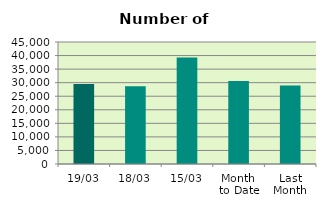
| Category | Series 0 |
|---|---|
| 19/03 | 29480 |
| 18/03 | 28680 |
| 15/03 | 39246 |
| Month 
to Date | 30653.846 |
| Last
Month | 28915.6 |